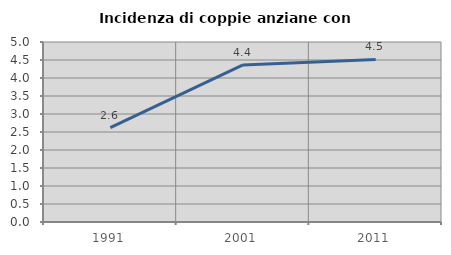
| Category | Incidenza di coppie anziane con figli |
|---|---|
| 1991.0 | 2.622 |
| 2001.0 | 4.363 |
| 2011.0 | 4.514 |